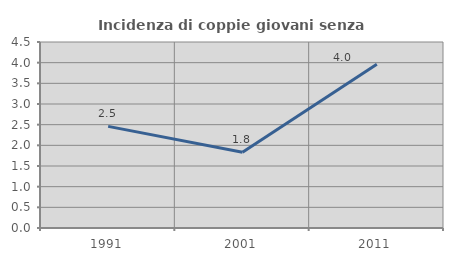
| Category | Incidenza di coppie giovani senza figli |
|---|---|
| 1991.0 | 2.459 |
| 2001.0 | 1.835 |
| 2011.0 | 3.96 |